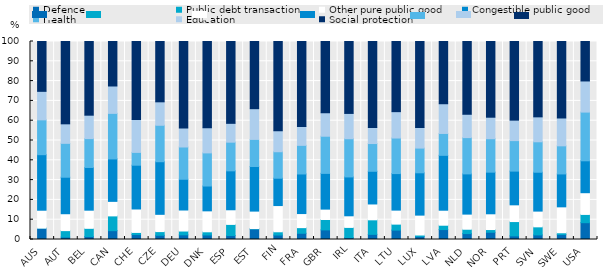
| Category | Defence | Public debt transaction | Other pure public good | Congestible public good | Health | Education | Social protection |
|---|---|---|---|---|---|---|---|
| AUS | 5.73 | 0.005 | 9.052 | 28.055 | 17.583 | 14.404 | 25.17 |
| AUT | 1.242 | 3.238 | 8.536 | 18.441 | 17.109 | 9.855 | 41.579 |
| BEL | 1.519 | 4.12 | 9.169 | 21.57 | 14.577 | 11.83 | 37.216 |
| CAN | 4.465 | 7.455 | 7.341 | 21.431 | 23.012 | 13.825 | 22.471 |
| CHE | 2.492 | 1.08 | 11.837 | 22.113 | 6.472 | 16.622 | 39.383 |
| CZE | 2.135 | 1.855 | 8.722 | 26.566 | 18.415 | 11.842 | 30.465 |
| DEU | 2.358 | 1.913 | 10.616 | 15.533 | 16.302 | 9.576 | 43.7 |
| DNK | 2.28 | 1.611 | 10.581 | 12.538 | 16.733 | 12.741 | 43.517 |
| ESP | 2.015 | 5.609 | 7.395 | 19.652 | 14.482 | 9.517 | 41.329 |
| EST | 5.32 | 0.184 | 8.837 | 22.52 | 13.692 | 15.516 | 33.931 |
| FIN | 2.252 | 1.647 | 13.238 | 13.81 | 13.373 | 10.555 | 45.125 |
| FRA | 3.147 | 2.842 | 7.109 | 19.996 | 14.458 | 9.503 | 42.946 |
| GBR | 4.856 | 5.247 | 5.243 | 18.046 | 18.768 | 11.854 | 35.985 |
| IRL | 0.945 | 5.161 | 5.866 | 19.629 | 19.286 | 12.787 | 36.326 |
| ITA | 2.605 | 7.335 | 8.006 | 16.507 | 14.013 | 8.041 | 43.493 |
| LTU | 4.745 | 3.016 | 7.079 | 18.452 | 17.96 | 13.316 | 35.432 |
| LUX | 1.541 | 0.722 | 10.049 | 21.374 | 12.478 | 10.406 | 43.43 |
| LVA | 5.018 | 2.194 | 7.581 | 27.718 | 11.044 | 15.012 | 31.434 |
| NLD | 2.988 | 2.19 | 7.643 | 20.312 | 18.323 | 11.795 | 36.749 |
| NOR | 3.654 | 1.375 | 7.957 | 21.026 | 16.881 | 10.867 | 38.24 |
| PRT | 1.832 | 7.224 | 8.453 | 17.027 | 15.405 | 10.342 | 39.716 |
| SVN | 2.308 | 4.084 | 7.95 | 19.632 | 15.373 | 12.597 | 38.056 |
| SWE | 2.495 | 0.899 | 13.098 | 16.621 | 14.193 | 14.067 | 38.627 |
| USA | 8.49 | 4.174 | 10.97 | 16.115 | 24.6 | 15.717 | 19.934 |